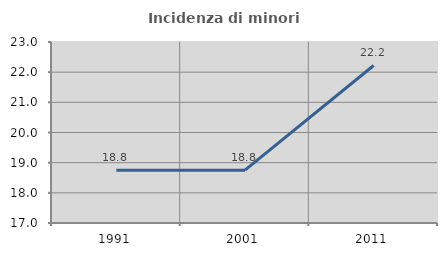
| Category | Incidenza di minori stranieri |
|---|---|
| 1991.0 | 18.75 |
| 2001.0 | 18.75 |
| 2011.0 | 22.222 |